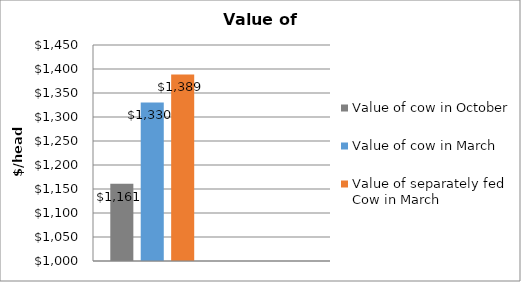
| Category | Value of cow in October | Value of cow in March | Value of separately fed Cow in March |
|---|---|---|---|
|  | 1160.996 | 1330.436 | 1388.585 |